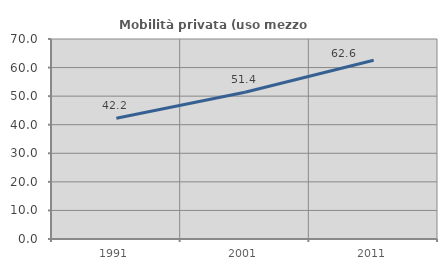
| Category | Mobilità privata (uso mezzo privato) |
|---|---|
| 1991.0 | 42.235 |
| 2001.0 | 51.363 |
| 2011.0 | 62.556 |